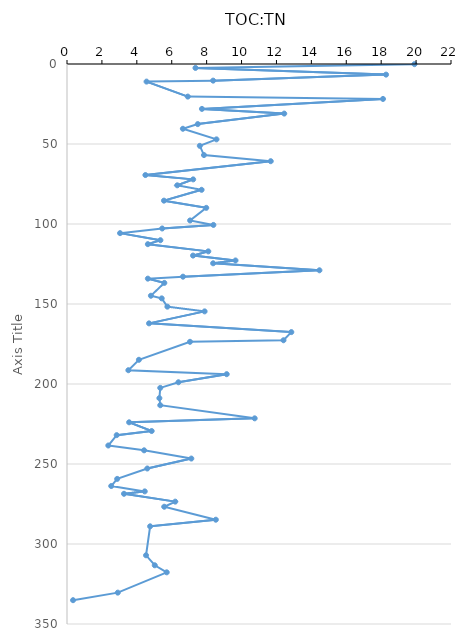
| Category | Series 0 |
|---|---|
| 19.907407407407405 | 0.09 |
| 7.3604060913705585 | 2.45 |
| 18.27956989247312 | 6.64 |
| 8.372093023255815 | 10.4 |
| 4.557640750670242 | 11 |
| 6.920415224913495 | 20.37 |
| 18.10344827586207 | 21.84 |
| 7.731958762886597 | 28.06 |
| 12.44635193133047 | 30.99 |
| 7.492795389048991 | 37.56 |
| 6.640625 | 40.48 |
| 8.563535911602209 | 47.1 |
| 7.608695652173914 | 51.15 |
| 7.847533632286995 | 56.91 |
| 11.673151750972762 | 60.75 |
| 4.491725768321514 | 69.4 |
| 7.228915662650602 | 72.11 |
| 6.315789473684211 | 75.82 |
| 7.711442786069652 | 78.63 |
| 5.555555555555555 | 85.41 |
| 7.9772079772079785 | 89.91 |
| 7.052896725440807 | 97.78 |
| 8.387096774193548 | 100.59 |
| 5.454545454545454 | 102.8 |
| 3.0405405405405403 | 105.71 |
| 5.352112676056339 | 110.13 |
| 4.633204633204633 | 112.6 |
| 8.095238095238095 | 117.11 |
| 7.220216606498195 | 119.74 |
| 9.655172413793103 | 122.79 |
| 8.372093023255815 | 124.55 |
| 14.462809917355372 | 128.93 |
| 6.645569620253164 | 132.92 |
| 4.632152588555858 | 134.15 |
| 5.5762081784386615 | 136.82 |
| 4.8076923076923075 | 144.84 |
| 5.426356589147287 | 146.48 |
| 5.750798722044728 | 151.66 |
| 7.8838174273858925 | 154.61 |
| 4.699738903394255 | 162.1 |
| 12.851405622489962 | 167.56 |
| 12.4031007751938 | 172.66 |
| 7.046979865771812 | 173.63 |
| 4.119850187265917 | 184.87 |
| 3.5156249999999996 | 191.39 |
| 9.150326797385622 | 193.86 |
| 6.382978723404255 | 198.92 |
| 5.343511450381679 | 202.43 |
| 5.2924791086350975 | 208.85 |
| 5.343511450381679 | 213.27 |
| 10.75268817204301 | 221.46 |
| 3.5587188612099645 | 223.94 |
| 4.850746268656716 | 229.39 |
| 2.8469750889679717 | 231.96 |
| 2.366863905325444 | 238.44 |
| 4.417670682730924 | 241.45 |
| 7.122507122507122 | 246.6 |
| 4.600484261501211 | 252.81 |
| 2.875399361022364 | 259.31 |
| 2.535211267605634 | 263.76 |
| 4.4543429844097995 | 267.12 |
| 3.2653061224489797 | 268.62 |
| 6.2015503875969 | 273.52 |
| 5.571030640668524 | 276.71 |
| 8.527131782945736 | 284.82 |
| 4.761904761904762 | 288.95 |
| 4.528301886792453 | 307.06 |
| 5.027932960893855 | 313.3 |
| 5.714285714285714 | 317.7 |
| 2.909090909090909 | 330.4 |
| 0.34602076124567477 | 335.12 |